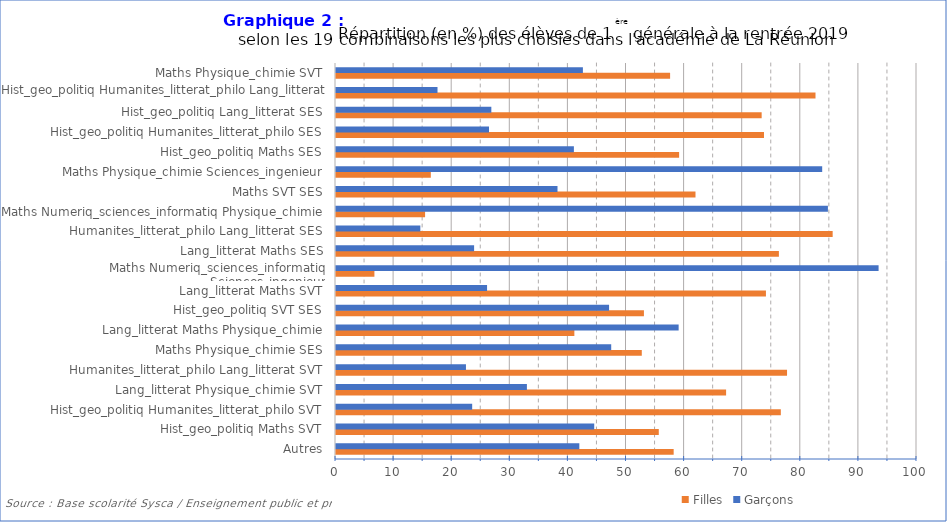
| Category | Filles | Garçons |
|---|---|---|
| Autres | 58.119 | 41.881 |
| Hist_geo_politiq Maths SVT | 55.556 | 44.444 |
| Hist_geo_politiq Humanites_litterat_philo SVT | 76.562 | 23.438 |
| Lang_litterat Physique_chimie SVT | 67.143 | 32.857 |
| Humanites_litterat_philo Lang_litterat SVT | 77.632 | 22.368 |
| Maths Physique_chimie SES | 52.632 | 47.368 |
| Lang_litterat Maths Physique_chimie | 41.026 | 58.974 |
| Hist_geo_politiq SVT SES | 53 | 47 |
| Lang_litterat Maths SVT | 74 | 26 |
| Maths Numeriq_sciences_informatiq Sciences_ingenieur | 6.612 | 93.388 |
| Lang_litterat Maths SES | 76.23 | 23.77 |
| Humanites_litterat_philo Lang_litterat SES | 85.484 | 14.516 |
| Maths Numeriq_sciences_informatiq Physique_chimie | 15.333 | 84.667 |
| Maths SVT SES | 61.875 | 38.125 |
| Maths Physique_chimie Sciences_ingenieur | 16.318 | 83.682 |
| Hist_geo_politiq Maths SES | 59.055 | 40.945 |
| Hist_geo_politiq Humanites_litterat_philo SES | 73.665 | 26.335 |
| Hist_geo_politiq Lang_litterat SES | 73.264 | 26.736 |
| Hist_geo_politiq Humanites_litterat_philo Lang_litterat | 82.53 | 17.47 |
| Maths Physique_chimie SVT | 57.505 | 42.495 |